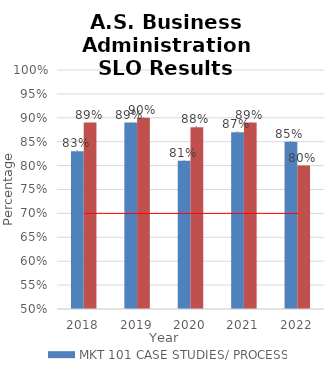
| Category | MKT 101 CASE STUDIES/ PROCESS | MGT 201 CASE STUDIES/ PROJECTS |
|---|---|---|
| 0 | 0.83 | 0.89 |
| 1 | 0.89 | 0.9 |
| 2 | 0.81 | 0.88 |
| 3 | 0.87 | 0.89 |
| 4 | 0.85 | 0.8 |